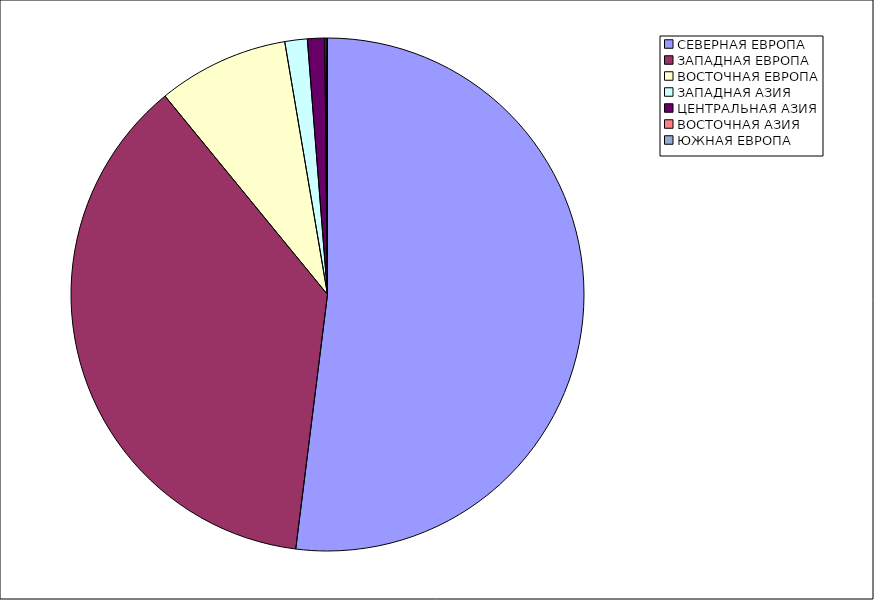
| Category | Оборот |
|---|---|
| СЕВЕРНАЯ ЕВРОПА | 51.976 |
| ЗАПАДНАЯ ЕВРОПА | 37.101 |
| ВОСТОЧНАЯ ЕВРОПА | 8.254 |
| ЗАПАДНАЯ АЗИЯ | 1.414 |
| ЦЕНТРАЛЬНАЯ АЗИЯ | 1.083 |
| ВОСТОЧНАЯ АЗИЯ | 0.09 |
| ЮЖНАЯ ЕВРОПА | 0.082 |